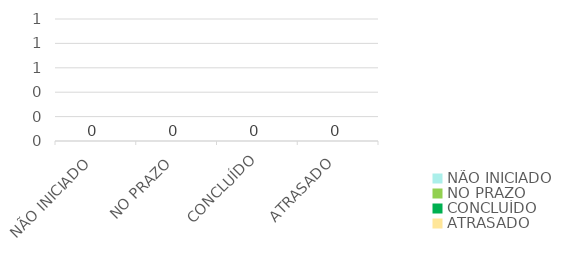
| Category | Series 0 |
|---|---|
| NÃO INICIADO | 0 |
| NO PRAZO | 0 |
| CONCLUÍDO | 0 |
| ATRASADO | 0 |